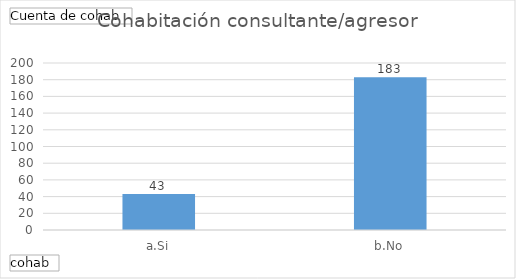
| Category | Total |
|---|---|
| a.Si | 43 |
| b.No | 183 |